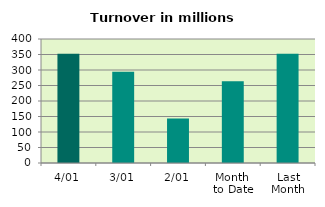
| Category | Series 0 |
|---|---|
| 4/01 | 352.752 |
| 3/01 | 294.269 |
| 2/01 | 143.196 |
| Month 
to Date | 263.406 |
| Last
Month | 352.227 |